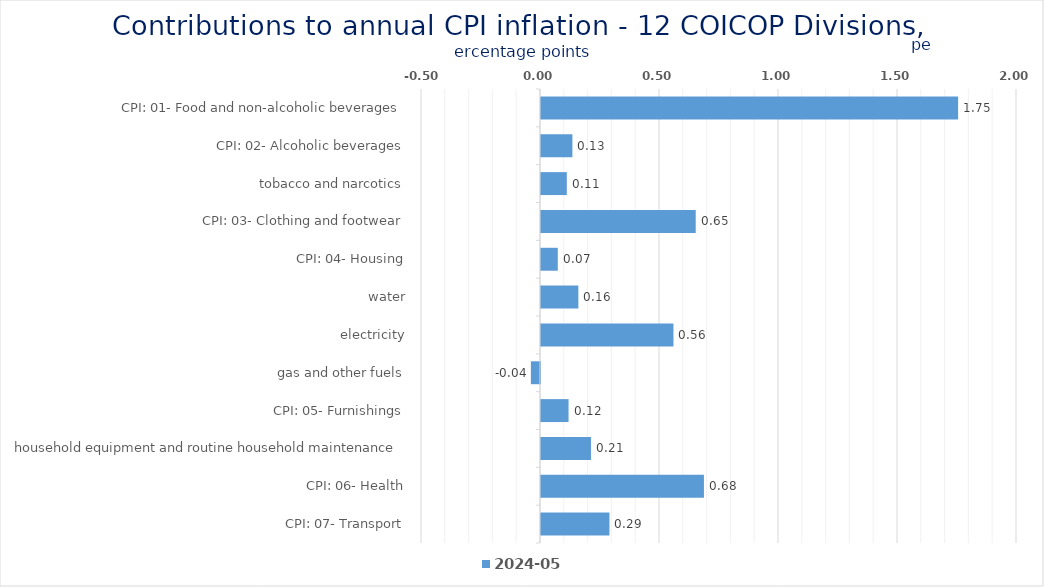
| Category | 2024-05 |
|---|---|
| CPI: 01- Food and non-alcoholic beverages | 1.753 |
| CPI: 02- Alcoholic beverages, tobacco and narcotics | 0.132 |
| CPI: 03- Clothing and footwear | 0.108 |
| CPI: 04- Housing, water, electricity, gas and other fuels | 0.65 |
| CPI: 05- Furnishings, household equipment and routine household maintenance | 0.071 |
| CPI: 06- Health | 0.157 |
| CPI: 07- Transport | 0.557 |
| CPI: 08- Communication | -0.038 |
| CPI: 09- Recreation and culture | 0.116 |
| CPI: 10- Education | 0.21 |
| CPI: 11- Restaurants and hotels | 0.685 |
| CPI: 12- Miscellaneous goods and services | 0.288 |